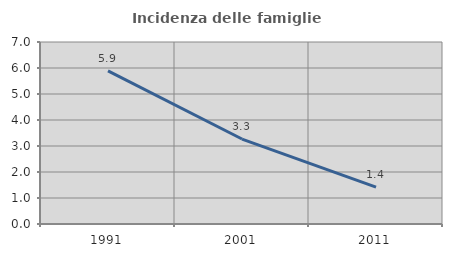
| Category | Incidenza delle famiglie numerose |
|---|---|
| 1991.0 | 5.888 |
| 2001.0 | 3.268 |
| 2011.0 | 1.42 |